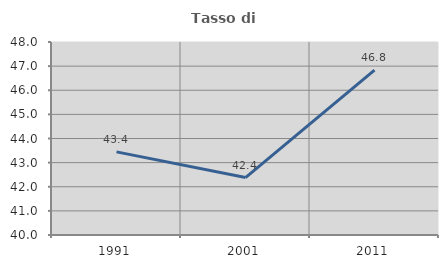
| Category | Tasso di occupazione   |
|---|---|
| 1991.0 | 43.447 |
| 2001.0 | 42.38 |
| 2011.0 | 46.835 |